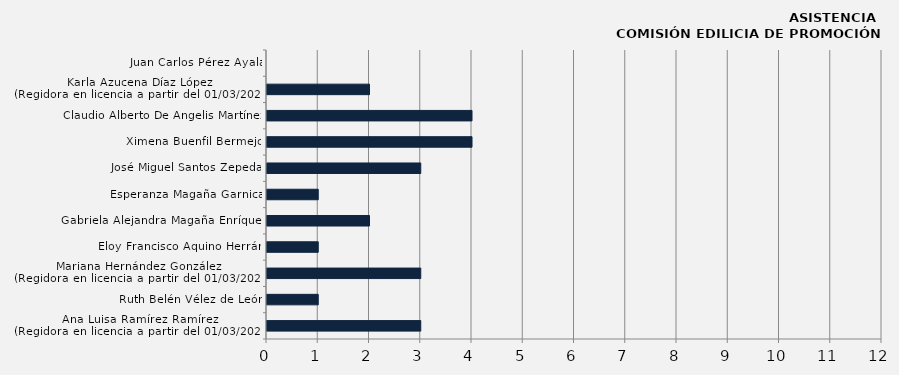
| Category | Ana Luisa Ramírez Ramírez
(Regidora en licencia a partir del 01/03/2024) |
|---|---|
| Ana Luisa Ramírez Ramírez
(Regidora en licencia a partir del 01/03/2024) | 3 |
| Ruth Belén Vélez de León | 1 |
| Mariana Hernández González 
(Regidora en licencia a partir del 01/03/2024) | 3 |
| Eloy Francisco Aquino Herrán | 1 |
| Gabriela Alejandra Magaña Enríquez | 2 |
| Esperanza Magaña Garnica | 1 |
| José Miguel Santos Zepeda | 3 |
| Ximena Buenfil Bermejo | 4 |
| Claudio Alberto De Angelis Martínez | 4 |
| Karla Azucena Díaz López
(Regidora en licencia a partir del 01/03/2024) | 2 |
| Juan Carlos Pérez Ayala | 0 |